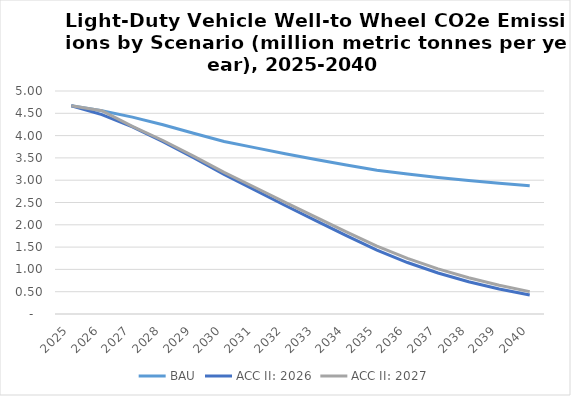
| Category | BAU | ACC II: 2026 | ACC II: 2027 |
|---|---|---|---|
| 2025.0 | 4.67 | 4.67 | 4.67 |
| 2026.0 | 4.558 | 4.47 | 4.558 |
| 2027.0 | 4.415 | 4.193 | 4.207 |
| 2028.0 | 4.243 | 3.865 | 3.89 |
| 2029.0 | 4.053 | 3.503 | 3.539 |
| 2030.0 | 3.867 | 3.129 | 3.177 |
| 2031.0 | 3.73 | 2.782 | 2.841 |
| 2032.0 | 3.594 | 2.432 | 2.503 |
| 2033.0 | 3.464 | 2.095 | 2.173 |
| 2034.0 | 3.339 | 1.756 | 1.842 |
| 2035.0 | 3.223 | 1.432 | 1.523 |
| 2036.0 | 3.138 | 1.154 | 1.247 |
| 2037.0 | 3.062 | 0.92 | 1.013 |
| 2038.0 | 2.992 | 0.723 | 0.813 |
| 2039.0 | 2.93 | 0.56 | 0.643 |
| 2040.0 | 2.876 | 0.427 | 0.502 |